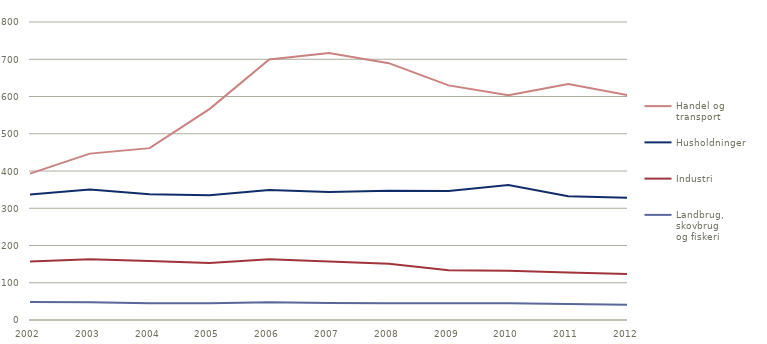
| Category | Handel og transport | Husholdninger | Industri | Landbrug, skovbrug 
og fiskeri |
|---|---|---|---|---|
| 2002 | 392.888 | 337.144 | 157.272 | 47.99 |
| 2003 | 446.67 | 350.234 | 162.819 | 47.669 |
| 2004 | 461.391 | 337.898 | 158.092 | 45.081 |
| 2005 | 566.257 | 334.815 | 153.256 | 44.805 |
| 2006 | 699.27 | 349.032 | 163.029 | 47.389 |
| 2007 | 717.044 | 343.424 | 156.846 | 45.4 |
| 2008 | 689.534 | 347.111 | 151.294 | 45.144 |
| 2009 | 629.841 | 346.097 | 133.547 | 45.034 |
| 2010 | 603.379 | 362.443 | 132.022 | 44.668 |
| 2011 | 633.719 | 332.201 | 127.688 | 43.068 |
| 2012 | 603.796 | 327.815 | 123.63 | 40.574 |